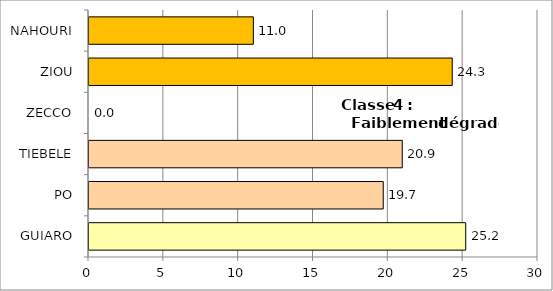
| Category | Series 0 |
|---|---|
| GUIARO | 25.17 |
| PO | 19.66 |
| TIEBELE | 20.93 |
| ZECCO | 0 |
| ZIOU | 24.27 |
| NAHOURI | 10.983 |